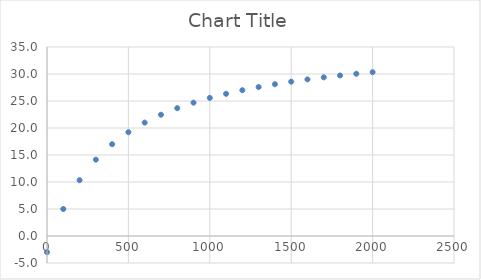
| Category | Series 0 |
|---|---|
| 0.0 | -3 |
| 100.0 | 5 |
| 200.0 | 10.333 |
| 300.0 | 14.143 |
| 400.0 | 17 |
| 500.0 | 19.222 |
| 600.0 | 21 |
| 700.0 | 22.455 |
| 800.0 | 23.667 |
| 900.0 | 24.692 |
| 1000.0 | 25.571 |
| 1100.0 | 26.333 |
| 1200.0 | 27 |
| 1300.0 | 27.588 |
| 1400.0 | 28.111 |
| 1500.0 | 28.579 |
| 1600.0 | 29 |
| 1700.0 | 29.381 |
| 1800.0 | 29.727 |
| 1900.0 | 30.043 |
| 2000.0 | 30.333 |